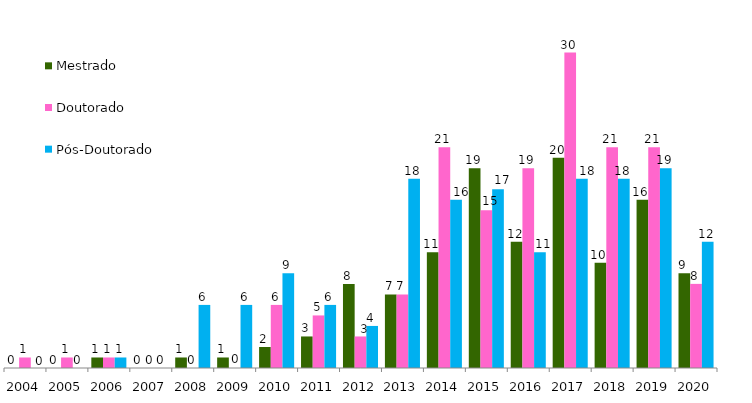
| Category | Mestrado | Doutorado  | Pós-Doutorado  |
|---|---|---|---|
| 2004.0 | 0 | 1 | 0 |
| 2005.0 | 0 | 1 | 0 |
| 2006.0 | 1 | 1 | 1 |
| 2007.0 | 0 | 0 | 0 |
| 2008.0 | 1 | 0 | 6 |
| 2009.0 | 1 | 0 | 6 |
| 2010.0 | 2 | 6 | 9 |
| 2011.0 | 3 | 5 | 6 |
| 2012.0 | 8 | 3 | 4 |
| 2013.0 | 7 | 7 | 18 |
| 2014.0 | 11 | 21 | 16 |
| 2015.0 | 19 | 15 | 17 |
| 2016.0 | 12 | 19 | 11 |
| 2017.0 | 20 | 30 | 18 |
| 2018.0 | 10 | 21 | 18 |
| 2019.0 | 16 | 21 | 19 |
| 2020.0 | 9 | 8 | 12 |